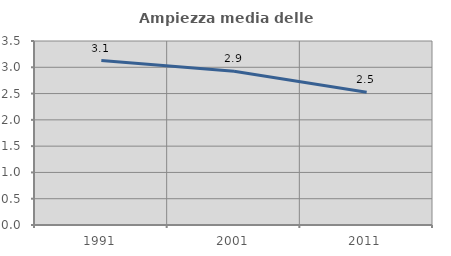
| Category | Ampiezza media delle famiglie |
|---|---|
| 1991.0 | 3.128 |
| 2001.0 | 2.926 |
| 2011.0 | 2.525 |